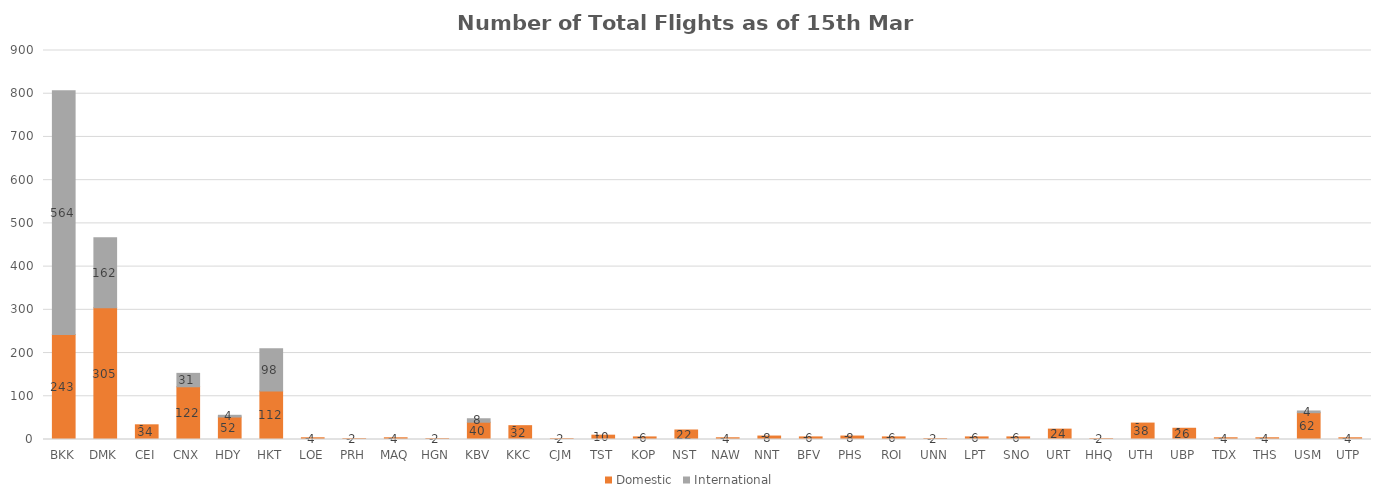
| Category | Domestic | International |
|---|---|---|
| BKK | 243 | 564 |
| DMK | 305 | 162 |
| CEI | 34 | 0 |
| CNX | 122 | 31 |
| HDY | 52 | 4 |
| HKT | 112 | 98 |
| LOE | 4 | 0 |
| PRH | 2 | 0 |
| MAQ | 4 | 0 |
| HGN | 2 | 0 |
| KBV | 40 | 8 |
| KKC | 32 | 0 |
| CJM | 2 | 0 |
| TST | 10 | 0 |
| KOP | 6 | 0 |
| NST | 22 | 0 |
| NAW | 4 | 0 |
| NNT | 8 | 0 |
| BFV | 6 | 0 |
| PHS | 8 | 0 |
| ROI | 6 | 0 |
| UNN | 2 | 0 |
| LPT | 6 | 0 |
| SNO | 6 | 0 |
| URT | 24 | 0 |
| HHQ | 2 | 0 |
| UTH | 38 | 0 |
| UBP | 26 | 0 |
| TDX | 4 | 0 |
| THS | 4 | 0 |
| USM | 62 | 4 |
| UTP | 4 | 0 |